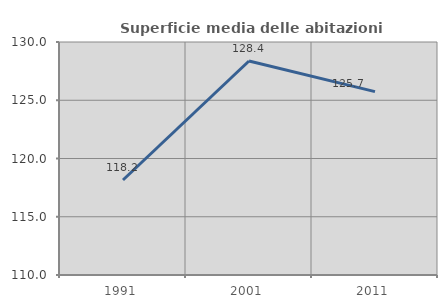
| Category | Superficie media delle abitazioni occupate |
|---|---|
| 1991.0 | 118.156 |
| 2001.0 | 128.367 |
| 2011.0 | 125.743 |